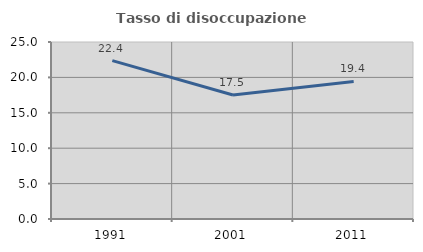
| Category | Tasso di disoccupazione giovanile  |
|---|---|
| 1991.0 | 22.363 |
| 2001.0 | 17.508 |
| 2011.0 | 19.433 |